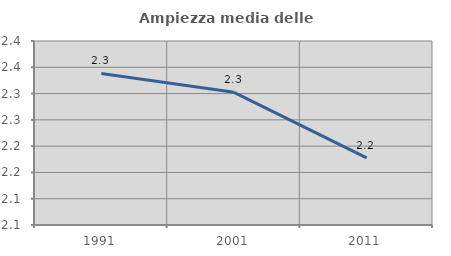
| Category | Ampiezza media delle famiglie |
|---|---|
| 1991.0 | 2.338 |
| 2001.0 | 2.302 |
| 2011.0 | 2.178 |